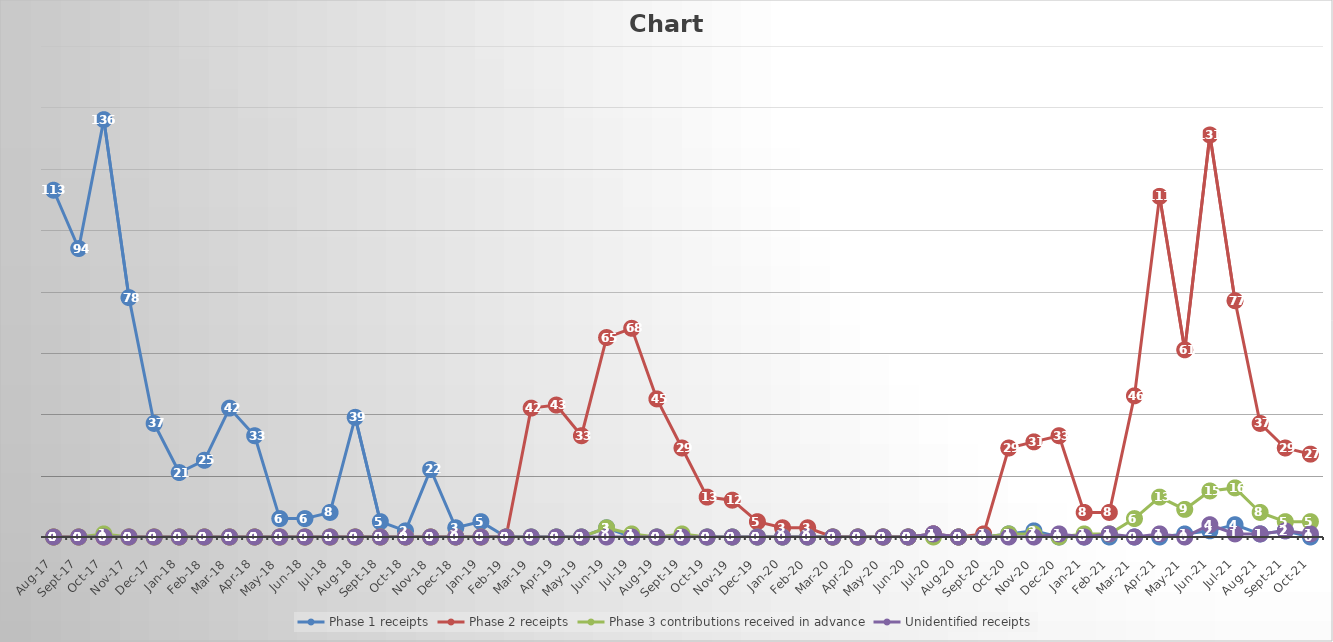
| Category | Phase 1 receipts | Phase 2 receipts | Phase 3 contributions received in advance | Unidentified receipts |
|---|---|---|---|---|
| 2017-08-01 | 113 | 0 | 0 | 0 |
| 2017-09-01 | 94 | 0 | 0 | 0 |
| 2017-10-01 | 136 | 0 | 1 | 0 |
| 2017-11-01 | 78 | 0 | 0 | 0 |
| 2017-12-01 | 37 | 0 | 0 | 0 |
| 2018-01-01 | 21 | 0 | 0 | 0 |
| 2018-02-01 | 25 | 0 | 0 | 0 |
| 2018-03-01 | 42 | 0 | 0 | 0 |
| 2018-04-01 | 33 | 0 | 0 | 0 |
| 2018-05-01 | 6 | 0 | 0 | 0 |
| 2018-06-01 | 6 | 0 | 0 | 0 |
| 2018-07-01 | 8 | 0 | 0 | 0 |
| 2018-08-01 | 39 | 0 | 0 | 0 |
| 2018-09-01 | 5 | 0 | 0 | 0 |
| 2018-10-01 | 2 | 0 | 0 | 0 |
| 2018-11-01 | 22 | 0 | 0 | 0 |
| 2018-12-01 | 3 | 0 | 0 | 0 |
| 2019-01-01 | 5 | 0 | 0 | 0 |
| 2019-02-01 | 0 | 0 | 0 | 0 |
| 2019-03-01 | 0 | 42 | 0 | 0 |
| 2019-04-01 | 0 | 43 | 0 | 0 |
| 2019-05-01 | 0 | 33 | 0 | 0 |
| 2019-06-01 | 3 | 65 | 3 | 0 |
| 2019-07-01 | 0 | 68 | 1 | 0 |
| 2019-08-01 | 0 | 45 | 0 | 0 |
| 2019-09-01 | 0 | 29 | 1 | 0 |
| 2019-10-01 | 0 | 13 | 0 | 0 |
| 2019-11-01 | 0 | 12 | 0 | 0 |
| 2019-12-01 | 0 | 5 | 0 | 0 |
| 2020-01-01 | 0 | 3 | 0 | 0 |
| 2020-02-01 | 0 | 3 | 0 | 0 |
| 2020-03-01 | 0 | 0 | 0 | 0 |
| 2020-04-01 | 0 | 0 | 0 | 0 |
| 2020-05-01 | 0 | 0 | 0 | 0 |
| 2020-06-01 | 0 | 0 | 0 | 0 |
| 2020-07-01 | 1 | 1 | 0 | 1 |
| 2020-08-01 | 0 | 0 | 0 | 0 |
| 2020-09-01 | 0 | 1 | 0 | 0 |
| 2020-10-01 | 1 | 29 | 1 | 0 |
| 2020-11-01 | 2 | 31 | 1 | 0 |
| 2020-12-01 | 0 | 33 | 0 | 1 |
| 2021-01-01 | 0 | 8 | 1 | 0 |
| 2021-02-01 | 0 | 8 | 1 | 1 |
| 2021-03-01 | 0 | 46 | 6 | 0 |
| 2021-04-01 | 0 | 111 | 13 | 1 |
| 2021-05-01 | 1 | 61 | 9 | 0 |
| 2021-06-01 | 2 | 131 | 15 | 4 |
| 2021-07-01 | 4 | 77 | 16 | 1 |
| 2021-08-01 | 1 | 37 | 8 | 1 |
| 2021-09-01 | 2 | 29 | 5 | 2 |
| 2021-10-01 | 0 | 27 | 5 | 1 |